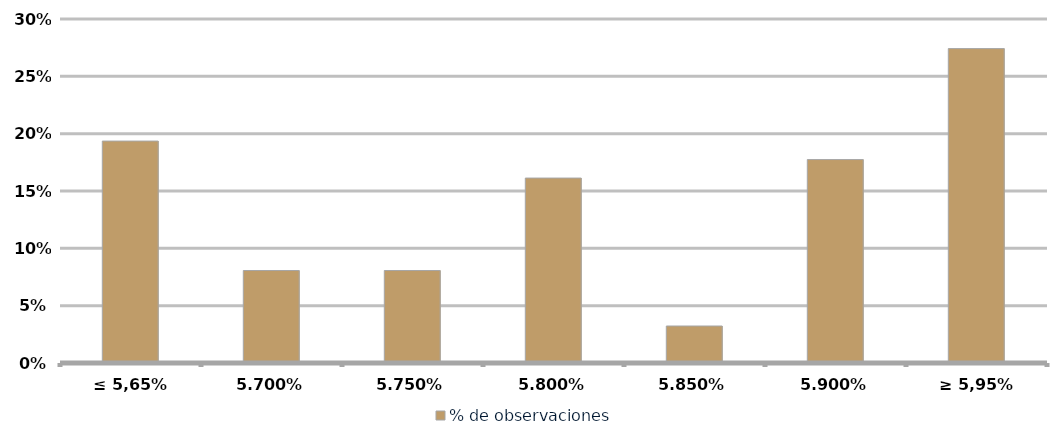
| Category | % de observaciones  |
|---|---|
| ≤ 5,65% | 0.194 |
| 5,70% | 0.081 |
| 5,75% | 0.081 |
| 5,80% | 0.161 |
| 5,85% | 0.032 |
| 5,90% | 0.177 |
| ≥ 5,95% | 0.274 |